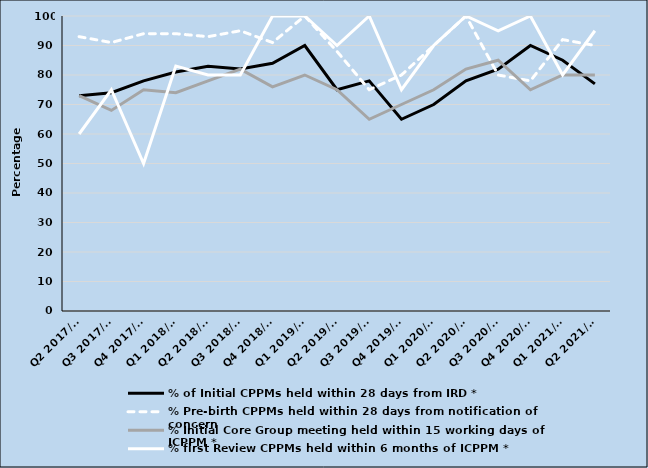
| Category | % of Initial CPPMs held within 28 days from IRD * | % Pre-birth CPPMs held within 28 days from notification of concern | % Initial Core Group meeting held within 15 working days of ICPPM * | % first Review CPPMs held within 6 months of ICPPM * |
|---|---|---|---|---|
| Q2 2017/18 | 73 | 93 | 73 | 60 |
| Q3 2017/18 | 74 | 91 | 68 | 75 |
| Q4 2017/18 | 78 | 94 | 75 | 50 |
| Q1 2018/19 | 81 | 94 | 74 | 83 |
| Q2 2018/19 | 83 | 93 | 78 | 80 |
| Q3 2018/19 | 82 | 95 | 82 | 80 |
| Q4 2018/19 | 84 | 91 | 76 | 100 |
| Q1 2019/20 | 90 | 100 | 80 | 100 |
| Q2 2019/20 | 75 | 88 | 75 | 90 |
| Q3 2019/20 | 78 | 75 | 65 | 100 |
| Q4 2019/20 | 65 | 80 | 70 | 75 |
| Q1 2020/21 | 70 | 90 | 75 | 90 |
| Q2 2020/21 | 78 | 100 | 82 | 100 |
| Q3 2020/21 | 82 | 80 | 85 | 95 |
| Q4 2020/21 | 90 | 78 | 75 | 100 |
| Q1 2021/22 | 85 | 92 | 80 | 80 |
| Q2 2021/22 | 77 | 90 | 80 | 95 |